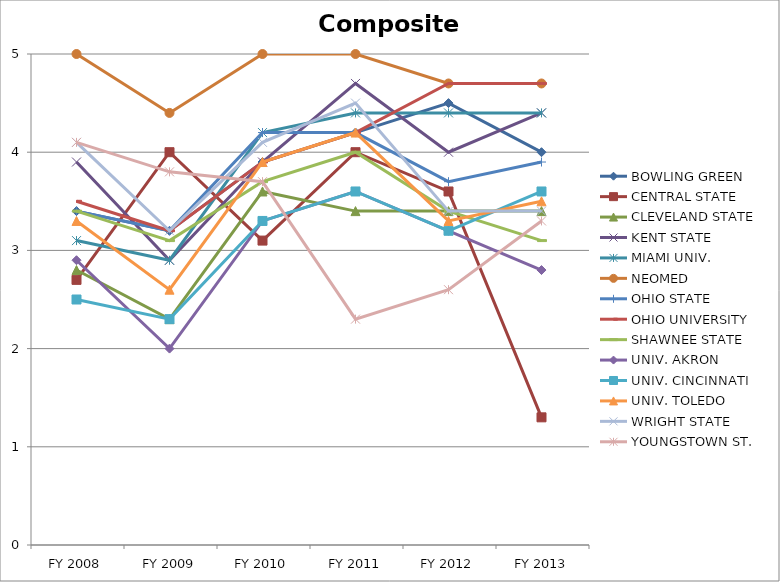
| Category | BOWLING GREEN  | CENTRAL STATE  | CLEVELAND STATE  | KENT STATE  | MIAMI UNIV.  | NEOMED  | OHIO STATE  | OHIO UNIVERSITY  | SHAWNEE STATE  | UNIV. AKRON  | UNIV. CINCINNATI  | UNIV. TOLEDO  | WRIGHT STATE  | YOUNGSTOWN ST.  |
|---|---|---|---|---|---|---|---|---|---|---|---|---|---|---|
| FY 2013 | 4 | 1.3 | 3.4 | 4.4 | 4.4 | 4.7 | 3.9 | 4.7 | 3.1 | 2.8 | 3.6 | 3.5 | 3.4 | 3.3 |
| FY 2012 | 4.5 | 3.6 | 3.4 | 4 | 4.4 | 4.7 | 3.7 | 4.7 | 3.4 | 3.2 | 3.2 | 3.3 | 3.4 | 2.6 |
| FY 2011 | 4.2 | 4 | 3.4 | 4.7 | 4.4 | 5 | 4.2 | 4.2 | 4 | 3.6 | 3.6 | 4.2 | 4.5 | 2.3 |
| FY 2010 | 3.9 | 3.1 | 3.6 | 3.9 | 4.2 | 5 | 4.2 | 3.9 | 3.7 | 3.3 | 3.3 | 3.9 | 4.1 | 3.7 |
| FY 2009 | 3.2 | 4 | 2.3 | 2.9 | 2.9 | 4.4 | 3.2 | 3.2 | 3.1 | 2 | 2.3 | 2.6 | 3.2 | 3.8 |
| FY 2008 | 3.4 | 2.7 | 2.8 | 3.9 | 3.1 | 5 | 3.4 | 3.5 | 3.4 | 2.9 | 2.5 | 3.3 | 4.1 | 4.1 |